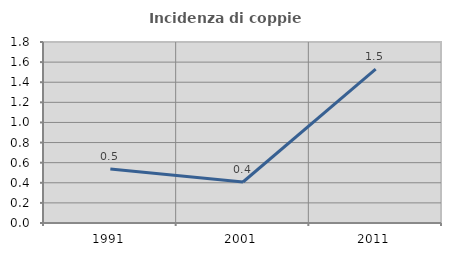
| Category | Incidenza di coppie miste |
|---|---|
| 1991.0 | 0.538 |
| 2001.0 | 0.408 |
| 2011.0 | 1.531 |